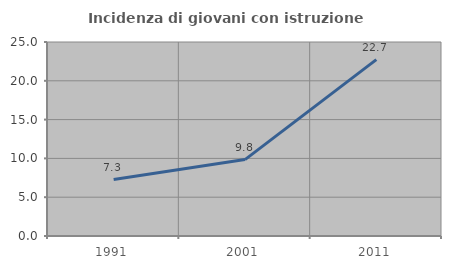
| Category | Incidenza di giovani con istruzione universitaria |
|---|---|
| 1991.0 | 7.273 |
| 2001.0 | 9.848 |
| 2011.0 | 22.727 |